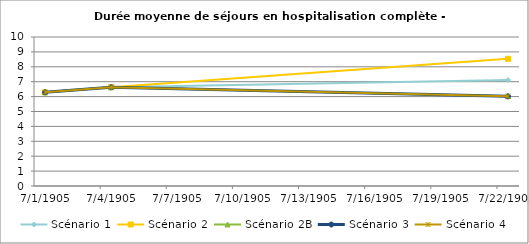
| Category | Scénario 1 | Scénario 2 | Scénario 2B | Scénario 3 | Scénario 4 |
|---|---|---|---|---|---|
| 2009.0 | 6.287 | 6.287 | 6.287 | 6.287 | 6.287 |
| 2012.0 | 6.629 | 6.629 | 6.629 | 6.629 | 6.629 |
| 2030.0 | 7.112 | 8.537 | 6.023 | 6.023 | 6.023 |